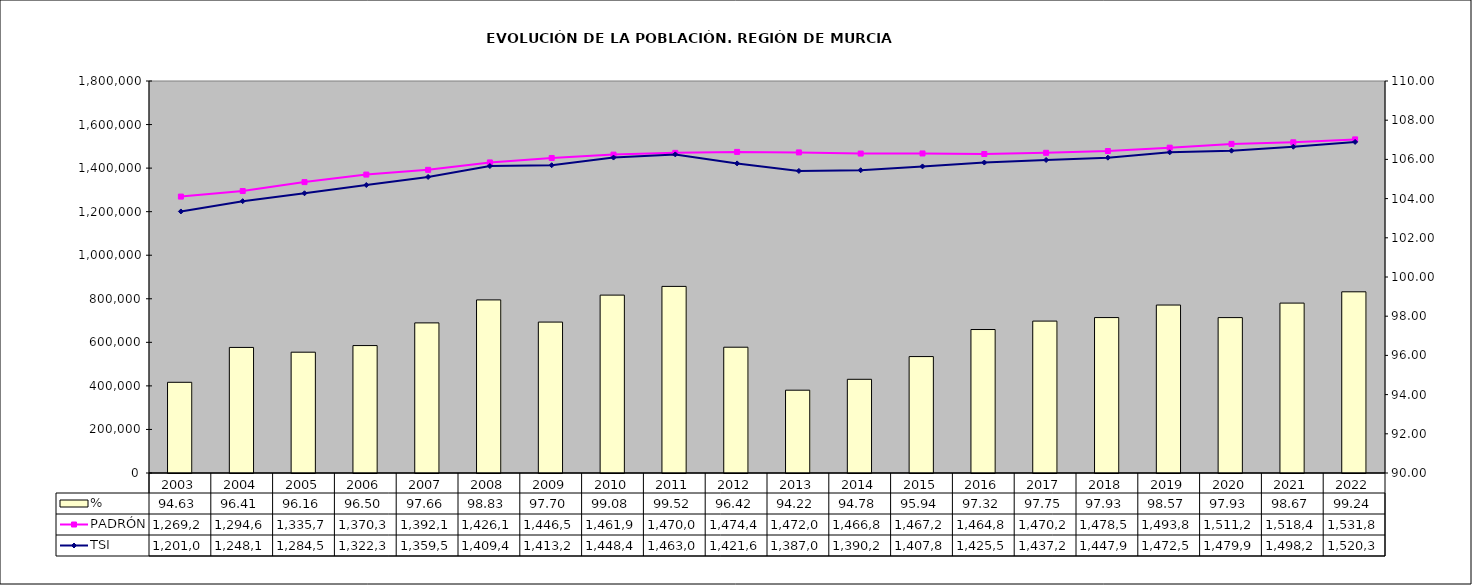
| Category | % |
|---|---|
| 2003.0 | 94.627 |
| 2004.0 | 96.407 |
| 2005.0 | 96.163 |
| 2006.0 | 96.501 |
| 2007.0 | 97.658 |
| 2008.0 | 98.831 |
| 2009.0 | 97.699 |
| 2010.0 | 99.076 |
| 2011.0 | 99.52 |
| 2012.0 | 96.418 |
| 2013.0 | 94.225 |
| 2014.0 | 94.78 |
| 2015.0 | 95.94 |
| 2016.0 | 97.32 |
| 2017.0 | 97.75 |
| 2018.0 | 97.93 |
| 2019.0 | 98.57 |
| 2020.0 | 97.928 |
| 2021.0 | 98.668 |
| 2022.0 | 99.244 |